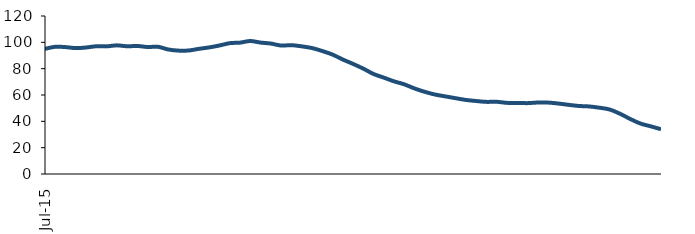
| Category | Series 0 |
|---|---|
| 2015-07-01 | 95.059 |
| 2015-08-01 | 96.602 |
| 2015-09-01 | 96.375 |
| 2015-10-01 | 95.605 |
| 2015-11-01 | 96.083 |
| 2015-12-01 | 97.021 |
| 2016-01-01 | 96.946 |
| 2016-02-01 | 97.709 |
| 2016-03-01 | 97.008 |
| 2016-04-01 | 97.233 |
| 2016-05-01 | 96.435 |
| 2016-06-01 | 96.624 |
| 2016-07-01 | 94.579 |
| 2016-08-01 | 93.712 |
| 2016-09-01 | 93.809 |
| 2016-10-01 | 95.08 |
| 2016-11-01 | 96.15 |
| 2016-12-01 | 97.606 |
| 2017-01-01 | 99.382 |
| 2017-02-01 | 99.775 |
| 2017-03-01 | 101.011 |
| 2017-04-01 | 99.808 |
| 2017-05-01 | 99.071 |
| 2017-06-01 | 97.564 |
| 2017-07-01 | 97.854 |
| 2017-08-01 | 96.947 |
| 2017-09-01 | 95.667 |
| 2017-10-01 | 93.423 |
| 2017-11-01 | 90.719 |
| 2017-12-01 | 86.968 |
| 2018-01-01 | 83.64 |
| 2018-02-01 | 80.036 |
| 2018-03-01 | 75.964 |
| 2018-04-01 | 73.187 |
| 2018-05-01 | 70.36 |
| 2018-06-01 | 68.078 |
| 2018-07-01 | 64.939 |
| 2018-08-01 | 62.389 |
| 2018-09-01 | 60.336 |
| 2018-10-01 | 58.933 |
| 2018-11-01 | 57.563 |
| 2018-12-01 | 56.243 |
| 2019-01-01 | 55.421 |
| 2019-02-01 | 54.781 |
| 2019-03-01 | 54.837 |
| 2019-04-01 | 54.03 |
| 2019-05-01 | 53.984 |
| 2019-06-01 | 53.826 |
| 2019-07-01 | 54.287 |
| 2019-08-01 | 54.245 |
| 2019-09-01 | 53.526 |
| 2019-10-01 | 52.526 |
| 2019-11-01 | 51.664 |
| 2019-12-01 | 51.311 |
| 2020-01-01 | 50.348 |
| 2020-02-01 | 48.978 |
| 2020-03-01 | 45.766 |
| 2020-04-01 | 41.808 |
| 2020-05-01 | 38.31 |
| 2020-06-01 | 36.214 |
| 2020-07-01 | 33.993 |